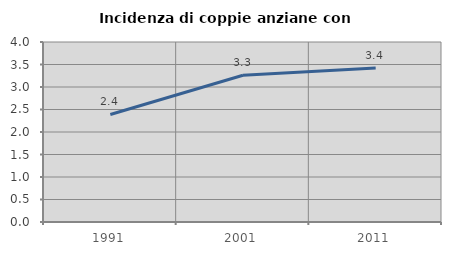
| Category | Incidenza di coppie anziane con figli |
|---|---|
| 1991.0 | 2.39 |
| 2001.0 | 3.262 |
| 2011.0 | 3.423 |